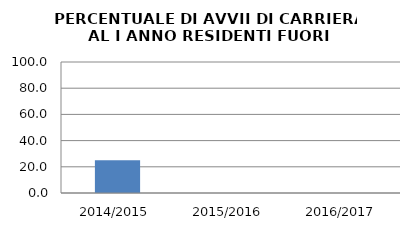
| Category | 2014/2015 2015/2016 2016/2017 |
|---|---|
| 2014/2015 | 25 |
| 2015/2016 | 0 |
| 2016/2017 | 0 |